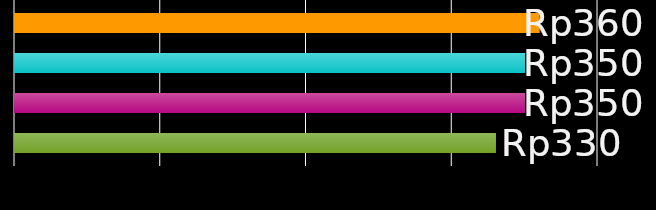
| Category | teman sekamar 1 | teman sekamar 2 | teman sekamar 3 | teman sekamar 4 |
|---|---|---|---|---|
| 0 | 360 | 350 | 350 | 330 |